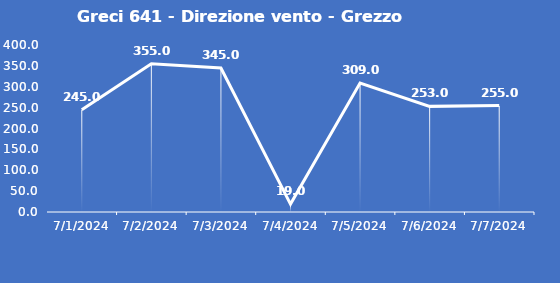
| Category | Greci 641 - Direzione vento - Grezzo (°N) |
|---|---|
| 7/1/24 | 245 |
| 7/2/24 | 355 |
| 7/3/24 | 345 |
| 7/4/24 | 19 |
| 7/5/24 | 309 |
| 7/6/24 | 253 |
| 7/7/24 | 255 |